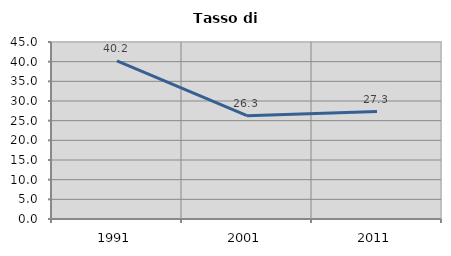
| Category | Tasso di disoccupazione   |
|---|---|
| 1991.0 | 40.212 |
| 2001.0 | 26.256 |
| 2011.0 | 27.325 |